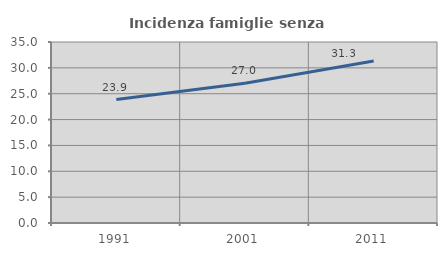
| Category | Incidenza famiglie senza nuclei |
|---|---|
| 1991.0 | 23.867 |
| 2001.0 | 27.021 |
| 2011.0 | 31.339 |